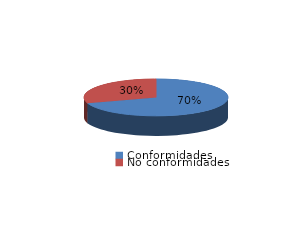
| Category | Series 0 |
|---|---|
| Conformidades | 4130 |
| No conformidades | 1777 |